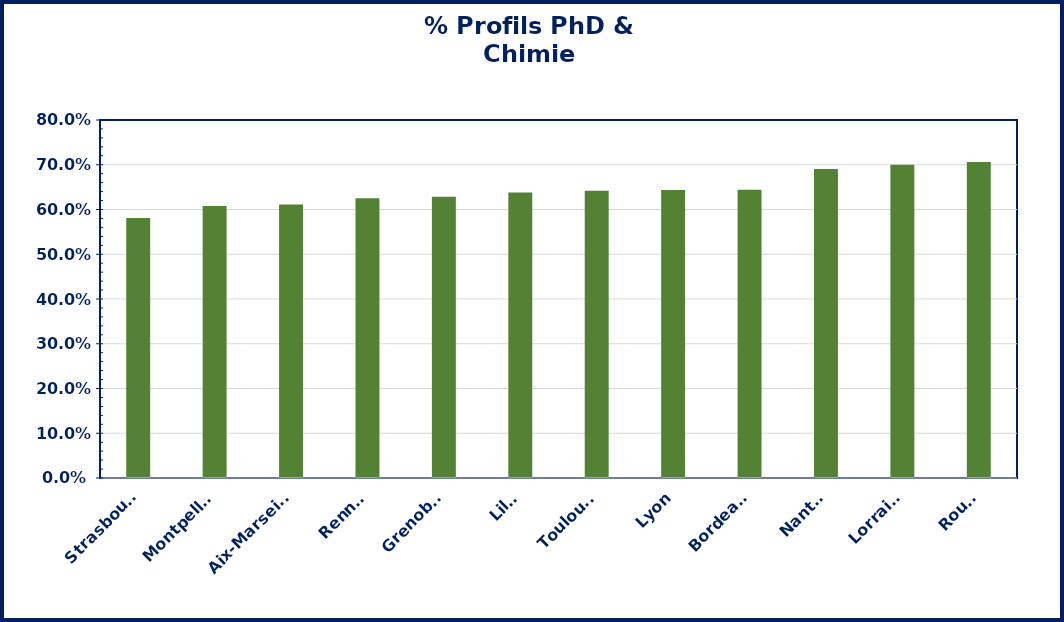
| Category | Series 0 |
|---|---|
| Strasbourg | 0.581 |
| Montpellier | 0.608 |
| Aix-Marseille | 0.611 |
| Rennes | 0.625 |
| Grenoble | 0.629 |
| Lille | 0.638 |
| Toulouse | 0.642 |
| Lyon | 0.644 |
| Bordeaux | 0.644 |
| Nantes | 0.69 |
| Lorraine | 0.7 |
| Rouen | 0.706 |